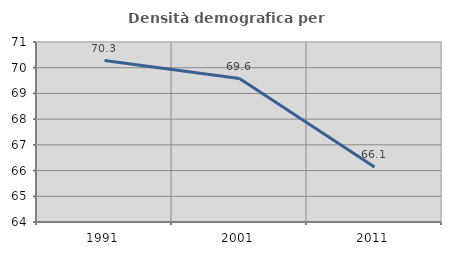
| Category | Densità demografica |
|---|---|
| 1991.0 | 70.28 |
| 2001.0 | 69.58 |
| 2011.0 | 66.14 |